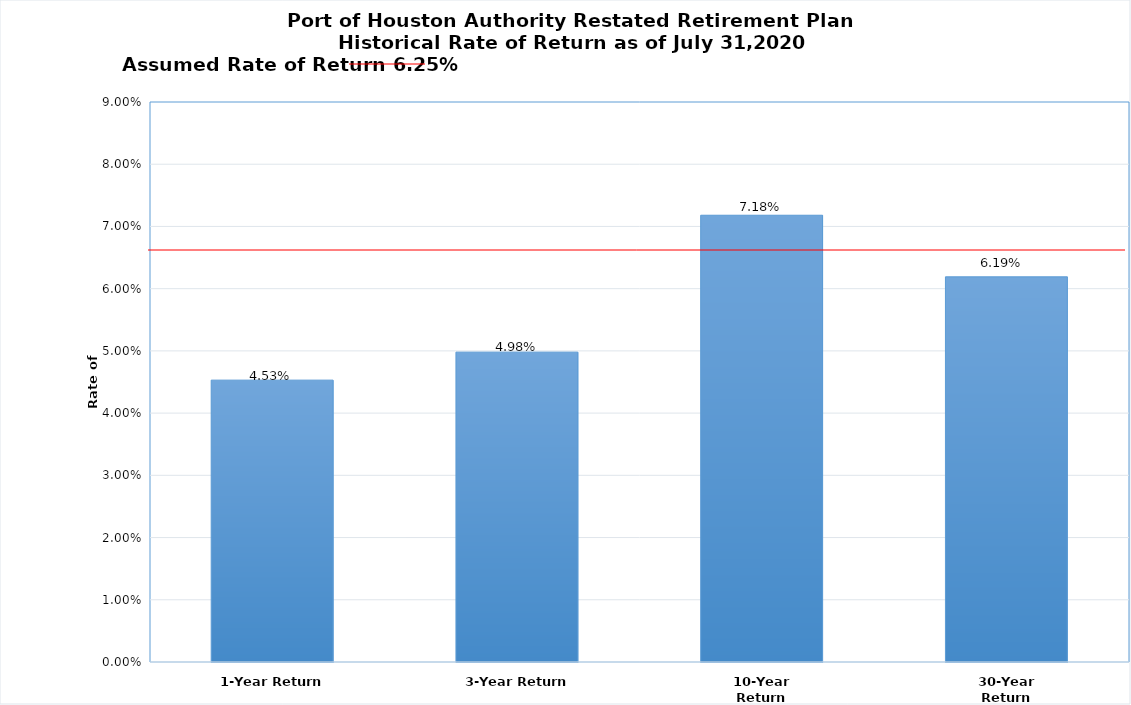
| Category | Series 0 |
|---|---|
| 1-Year Return | 0.045 |
| 3-Year Return | 0.05 |
| 10-Year Return | 0.072 |
| 30-Year Return | 0.062 |